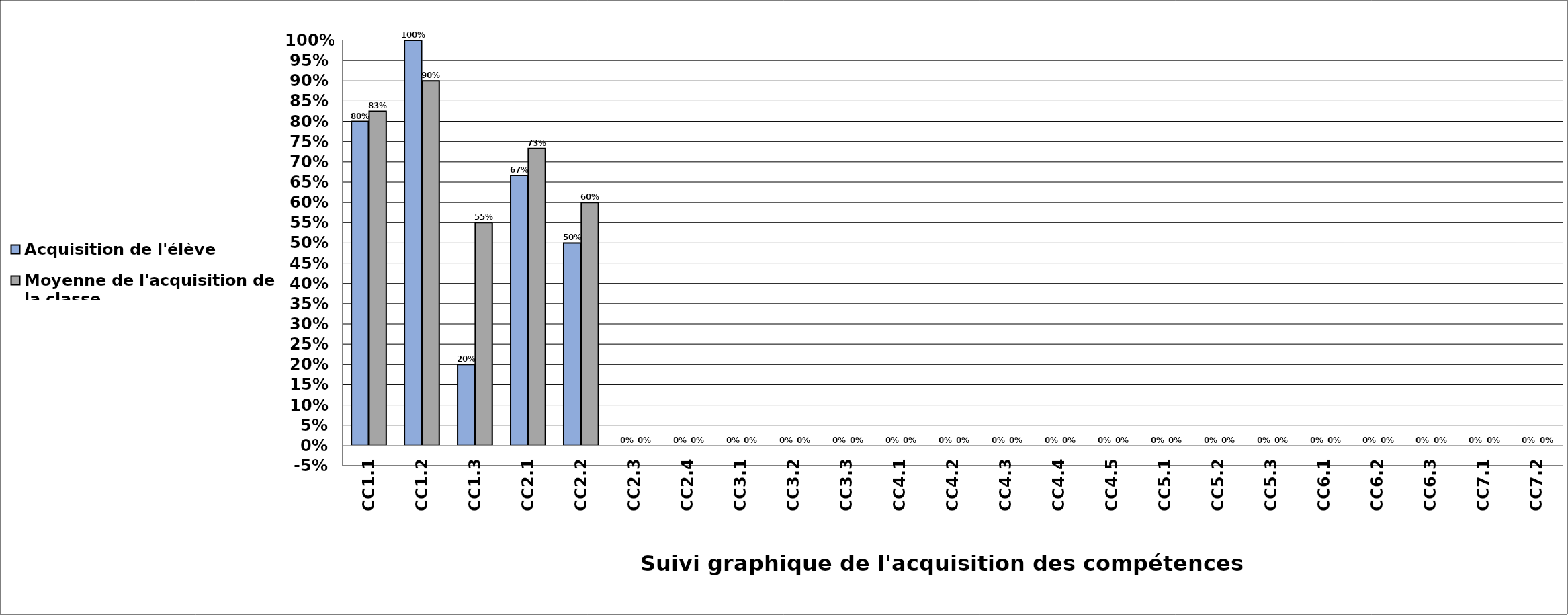
| Category | Acquisition de l'élève | Moyenne de l'acquisition de la classe |
|---|---|---|
| CC1.1 | 0.8 | 0.825 |
| CC1.2 | 1 | 0.9 |
| CC1.3 | 0.2 | 0.55 |
| CC2.1 | 0.667 | 0.733 |
| CC2.2 | 0.5 | 0.6 |
| CC2.3 | 0 | 0 |
| CC2.4 | 0 | 0 |
| CC3.1 | 0 | 0 |
| CC3.2 | 0 | 0 |
| CC3.3 | 0 | 0 |
| CC4.1 | 0 | 0 |
| CC4.2 | 0 | 0 |
| CC4.3 | 0 | 0 |
| CC4.4 | 0 | 0 |
| CC4.5 | 0 | 0 |
| CC5.1 | 0 | 0 |
| CC5.2 | 0 | 0 |
| CC5.3 | 0 | 0 |
| CC6.1 | 0 | 0 |
| CC6.2 | 0 | 0 |
| CC6.3 | 0 | 0 |
| CC7.1 | 0 | 0 |
| CC7.2 | 0 | 0 |